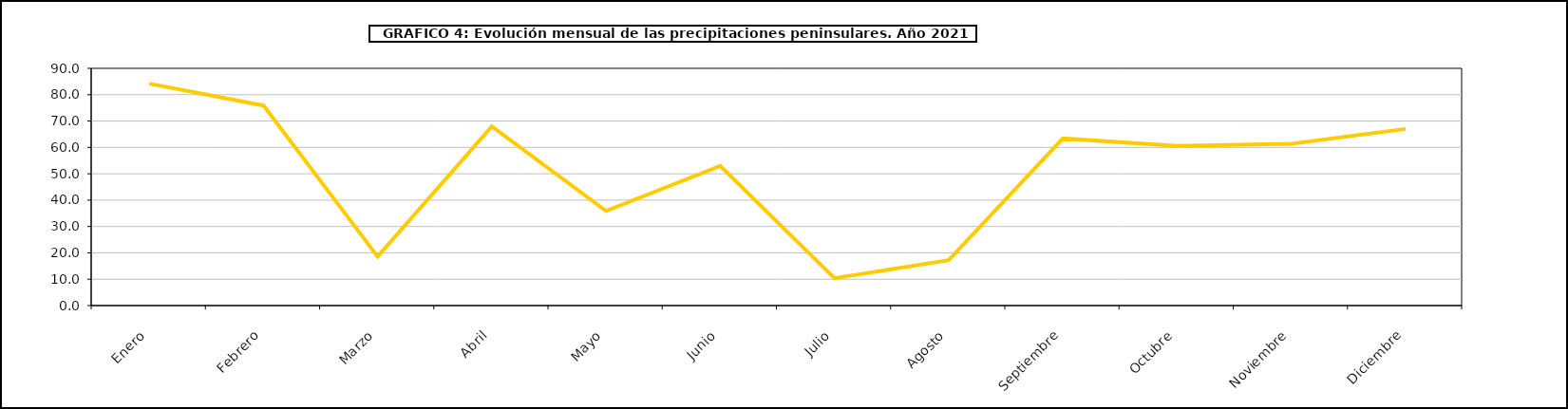
| Category | peninsula |
|---|---|
| 0 | 84.2 |
| 1 | 75.9 |
| 2 | 18.6 |
| 3 | 68 |
| 4 | 35.9 |
| 5 | 53 |
| 6 | 10.4 |
| 7 | 17.2 |
| 8 | 63.4 |
| 9 | 60.6 |
| 10 | 61.4 |
| 11 | 67 |